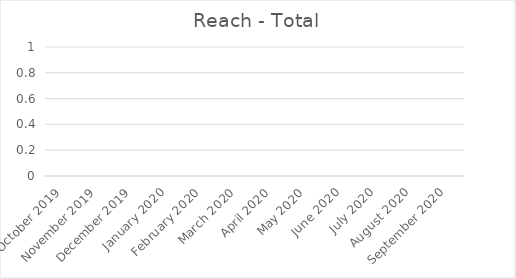
| Category | Total |
|---|---|
| October 2019 | 0 |
| November 2019 | 0 |
| December 2019 | 0 |
| January 2020 | 0 |
| February 2020 | 0 |
| March 2020 | 0 |
| April 2020 | 0 |
| May 2020 | 0 |
| June 2020 | 0 |
| July 2020 | 0 |
| August 2020 | 0 |
| September 2020 | 0 |